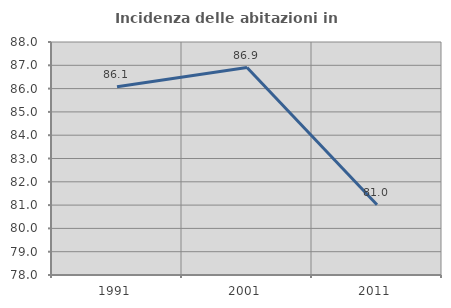
| Category | Incidenza delle abitazioni in proprietà  |
|---|---|
| 1991.0 | 86.076 |
| 2001.0 | 86.905 |
| 2011.0 | 81.013 |